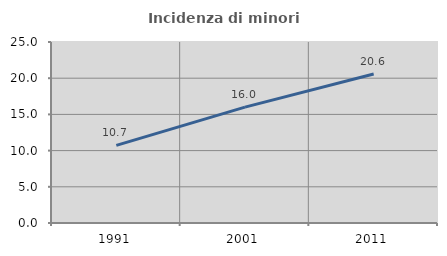
| Category | Incidenza di minori stranieri |
|---|---|
| 1991.0 | 10.721 |
| 2001.0 | 16.001 |
| 2011.0 | 20.572 |